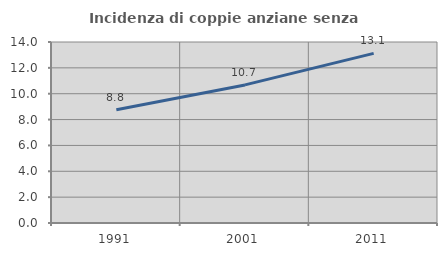
| Category | Incidenza di coppie anziane senza figli  |
|---|---|
| 1991.0 | 8.761 |
| 2001.0 | 10.681 |
| 2011.0 | 13.118 |